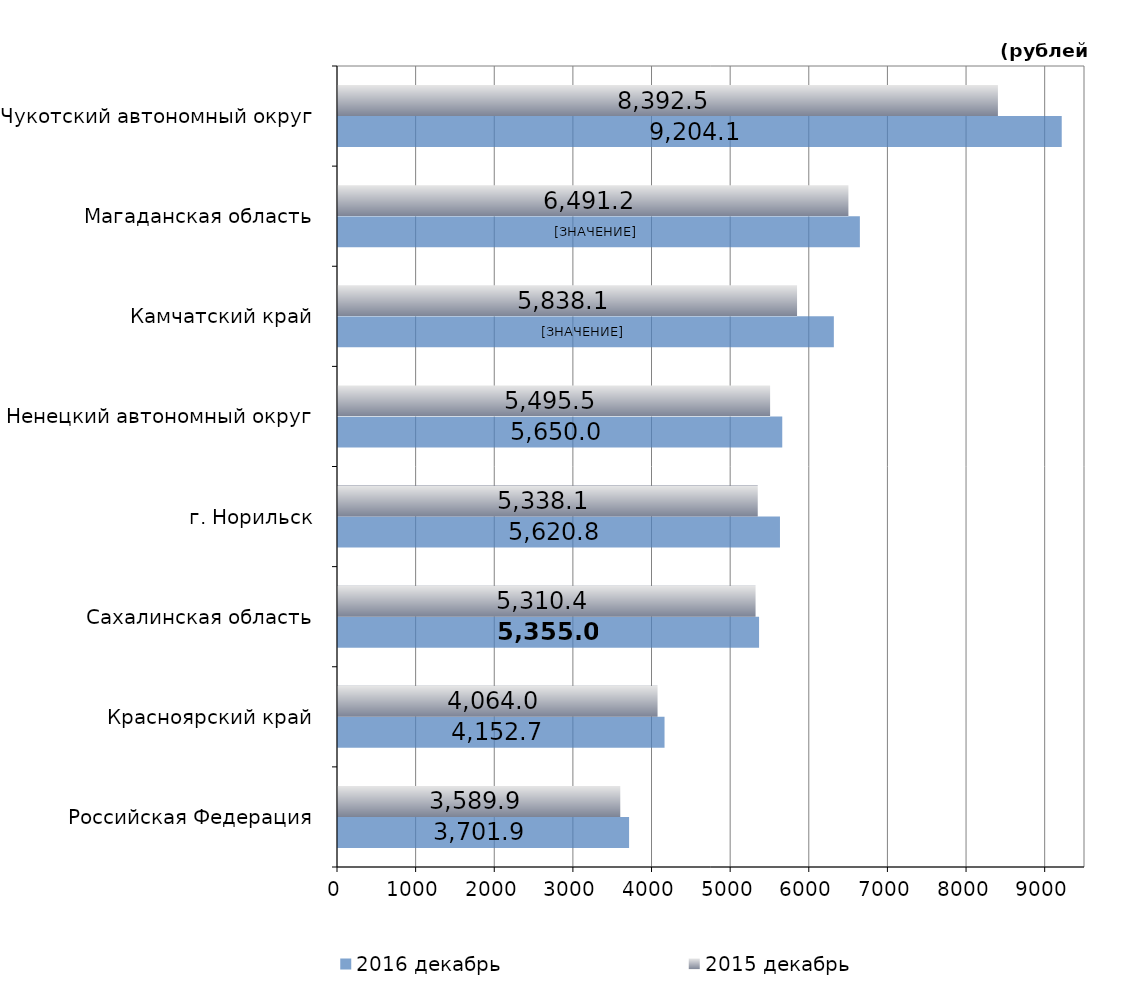
| Category | 2016 декабрь | 2015 декабрь |
|---|---|---|
| Российская Федерация | 3701.89 | 3589.92 |
| Красноярский край | 4152.71 | 4063.97 |
| Сахалинская область | 5355.04 | 5310.43 |
| г. Норильск | 5620.83 | 5338.1 |
| Ненецкий автономный округ | 5649.95 | 5495.5 |
| Камчатский край | 6305.93 | 5838.08 |
| Магаданская область | 6636.93 | 6491.18 |
| Чукотский автономный округ | 9204.08 | 8392.52 |